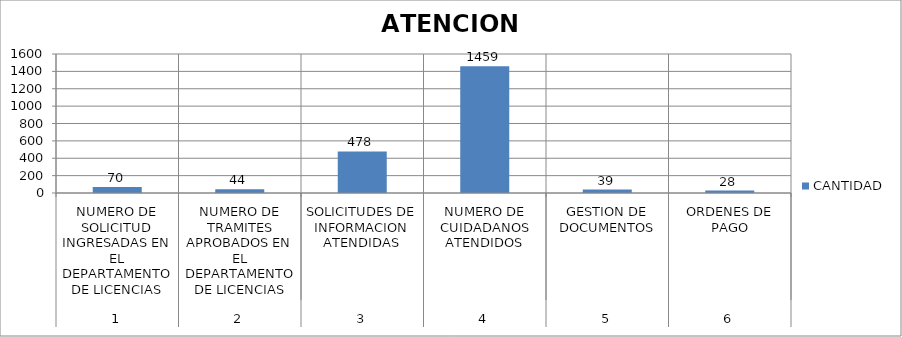
| Category | CANTIDAD |
|---|---|
| 0 | 70 |
| 1 | 44 |
| 2 | 478 |
| 3 | 1459 |
| 4 | 39 |
| 5 | 28 |